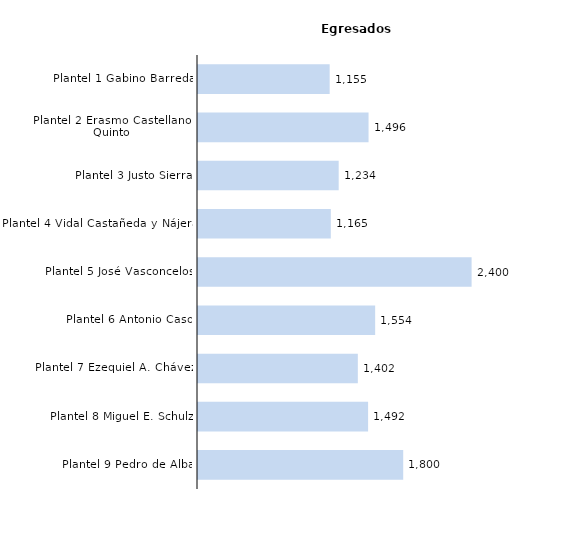
| Category | Series 0 |
|---|---|
| Plantel 9 Pedro de Alba | 1800 |
| Plantel 8 Miguel E. Schulz | 1492 |
| Plantel 7 Ezequiel A. Chávez | 1402 |
| Plantel 6 Antonio Caso | 1554 |
| Plantel 5 José Vasconcelos | 2400 |
| Plantel 4 Vidal Castañeda y Nájera | 1165 |
| Plantel 3 Justo Sierra | 1234 |
| Plantel 2 Erasmo Castellanos Quinto | 1496 |
| Plantel 1 Gabino Barreda | 1155 |